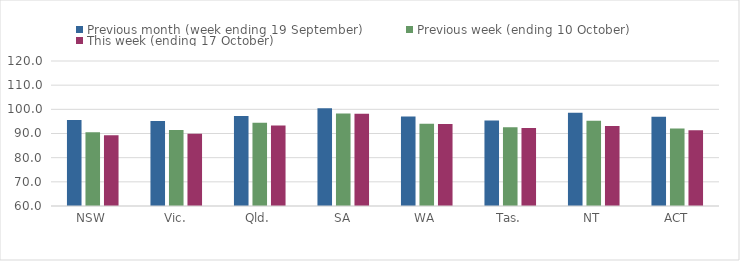
| Category | Previous month (week ending 19 September) | Previous week (ending 10 October) | This week (ending 17 October) |
|---|---|---|---|
| NSW | 95.62 | 90.48 | 89.3 |
| Vic. | 95.16 | 91.49 | 89.94 |
| Qld. | 97.28 | 94.42 | 93.31 |
| SA | 100.48 | 98.23 | 98.18 |
| WA | 97.07 | 94.01 | 93.97 |
| Tas. | 95.38 | 92.59 | 92.3 |
| NT | 98.6 | 95.29 | 93.09 |
| ACT | 96.88 | 92.1 | 91.33 |